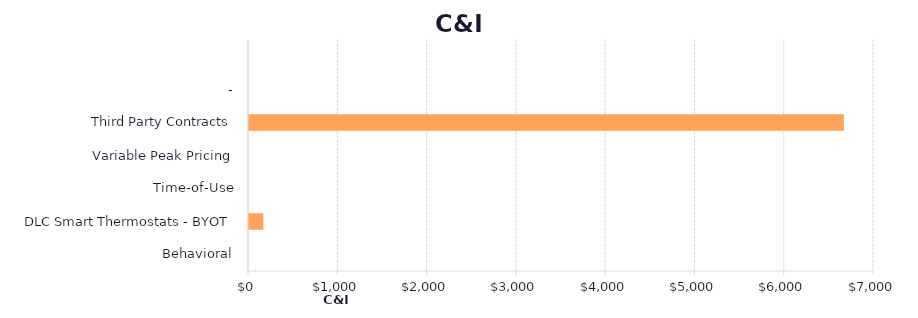
| Category | Series 1 |
|---|---|
| Behavioral | 0 |
| DLC Smart Thermostats - BYOT | 161.077 |
| Time-of-Use | 0 |
| Variable Peak Pricing | 0 |
| Third Party Contracts | 6662.96 |
| - | 0 |